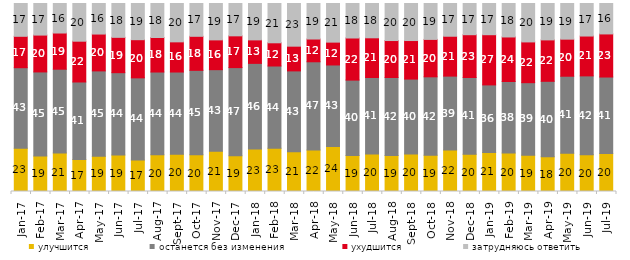
| Category | улучшится | останется без изменения | ухудшится | затрудняюсь ответить |
|---|---|---|---|---|
| 2017-01-01 | 23 | 42.85 | 16.7 | 17.45 |
| 2017-02-01 | 18.85 | 44.75 | 19.6 | 16.8 |
| 2017-03-01 | 20.5 | 44.55 | 19.25 | 15.7 |
| 2017-04-01 | 17 | 41.25 | 21.7 | 20.05 |
| 2017-05-01 | 18.7 | 45.45 | 19.6 | 16.25 |
| 2017-06-01 | 19.4 | 43.8 | 18.8 | 18 |
| 2017-07-01 | 16.7 | 43.75 | 20.3 | 19.25 |
| 2017-08-01 | 19.5 | 44.05 | 18.35 | 18.1 |
| 2017-09-01 | 19.8 | 43.75 | 16.05 | 20.4 |
| 2017-10-01 | 19.55 | 44.9 | 18.1 | 17.45 |
| 2017-11-01 | 21.45 | 43.35 | 15.85 | 19.35 |
| 2017-12-01 | 18.95 | 46.95 | 16.9 | 17.2 |
| 2018-01-01 | 22.55 | 45.6 | 12.5 | 19.35 |
| 2018-02-01 | 23 | 43.75 | 12.35 | 20.9 |
| 2018-03-01 | 21.15 | 43 | 13.15 | 22.7 |
| 2018-04-01 | 22.05 | 46.95 | 12.1 | 18.9 |
| 2018-05-01 | 23.95 | 43.35 | 12.15 | 20.55 |
| 2018-06-01 | 19.15 | 40.1 | 22.4 | 18.35 |
| 2018-07-01 | 19.95 | 40.7 | 21.1 | 18.25 |
| 2018-08-01 | 19.15 | 41.5 | 19.65 | 19.7 |
| 2018-09-01 | 19.95 | 39.85 | 20.5 | 19.7 |
| 2018-10-01 | 19.3 | 41.7 | 19.9 | 19.1 |
| 2018-11-01 | 22.056 | 39.321 | 21.208 | 17.415 |
| 2018-12-01 | 19.8 | 40.85 | 22.75 | 16.6 |
| 2019-01-01 | 20.75 | 35.95 | 26.7 | 16.6 |
| 2019-02-01 | 20.45 | 38.05 | 23.7 | 17.8 |
| 2019-03-01 | 19.344 | 38.538 | 21.681 | 20.438 |
| 2019-04-01 | 18.465 | 40.149 | 22.03 | 19.356 |
| 2019-05-01 | 20.406 | 40.911 | 19.713 | 18.97 |
| 2019-06-01 | 19.601 | 41.895 | 21.197 | 17.307 |
| 2019-07-01 | 20.149 | 40.743 | 22.921 | 16.188 |